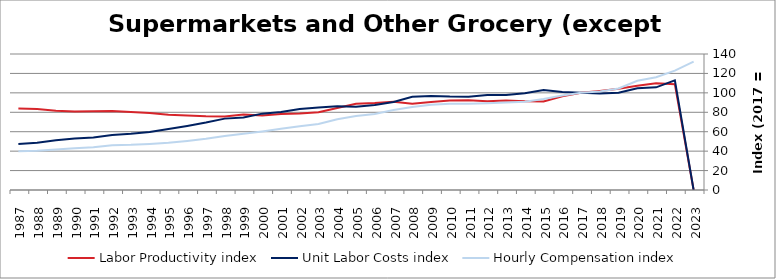
| Category | Labor Productivity index | Unit Labor Costs index | Hourly Compensation index |
|---|---|---|---|
| 2023.0 | 0 | 0 | 132.238 |
| 2022.0 | 108.8 | 112.932 | 122.87 |
| 2021.0 | 109.865 | 105.663 | 116.087 |
| 2020.0 | 107.321 | 104.73 | 112.397 |
| 2019.0 | 104.337 | 100.167 | 104.511 |
| 2018.0 | 101.955 | 99.37 | 101.312 |
| 2017.0 | 100 | 100 | 100 |
| 2016.0 | 96.467 | 100.893 | 97.328 |
| 2015.0 | 91.049 | 102.973 | 93.755 |
| 2014.0 | 91.332 | 99.543 | 90.915 |
| 2013.0 | 92.113 | 97.823 | 90.108 |
| 2012.0 | 91.321 | 97.848 | 89.356 |
| 2011.0 | 92.438 | 96.06 | 88.796 |
| 2010.0 | 92.205 | 96.156 | 88.661 |
| 2009.0 | 90.526 | 96.865 | 87.688 |
| 2008.0 | 88.91 | 96.042 | 85.391 |
| 2007.0 | 90.929 | 90.576 | 82.36 |
| 2006.0 | 89.511 | 87.436 | 78.265 |
| 2005.0 | 88.792 | 85.73 | 76.122 |
| 2004.0 | 84.431 | 86.293 | 72.858 |
| 2003.0 | 80.019 | 84.858 | 67.902 |
| 2002.0 | 78.663 | 83.325 | 65.547 |
| 2001.0 | 78.32 | 80.374 | 62.948 |
| 2000.0 | 76.691 | 78.615 | 60.291 |
| 1999.0 | 77.811 | 74.544 | 58.004 |
| 1998.0 | 75.753 | 73.473 | 55.658 |
| 1997.0 | 75.942 | 69.43 | 52.726 |
| 1996.0 | 76.581 | 65.949 | 50.505 |
| 1995.0 | 77.389 | 62.709 | 48.53 |
| 1994.0 | 79.361 | 59.599 | 47.299 |
| 1993.0 | 80.321 | 57.848 | 46.464 |
| 1992.0 | 81.439 | 56.687 | 46.165 |
| 1991.0 | 81.145 | 54.091 | 43.892 |
| 1990.0 | 80.802 | 53.095 | 42.902 |
| 1989.0 | 81.576 | 51.156 | 41.731 |
| 1988.0 | 83.327 | 48.639 | 40.529 |
| 1987.0 | 83.877 | 47.46 | 39.808 |